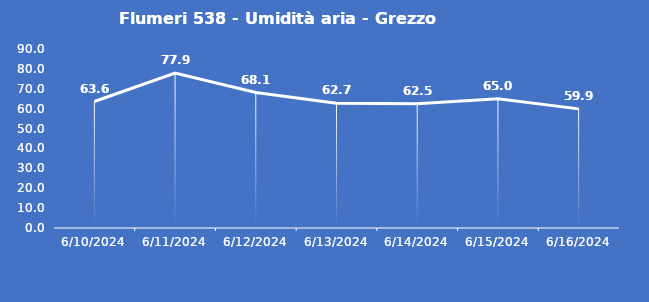
| Category | Flumeri 538 - Umidità aria - Grezzo (%) |
|---|---|
| 6/10/24 | 63.6 |
| 6/11/24 | 77.9 |
| 6/12/24 | 68.1 |
| 6/13/24 | 62.7 |
| 6/14/24 | 62.5 |
| 6/15/24 | 65 |
| 6/16/24 | 59.9 |